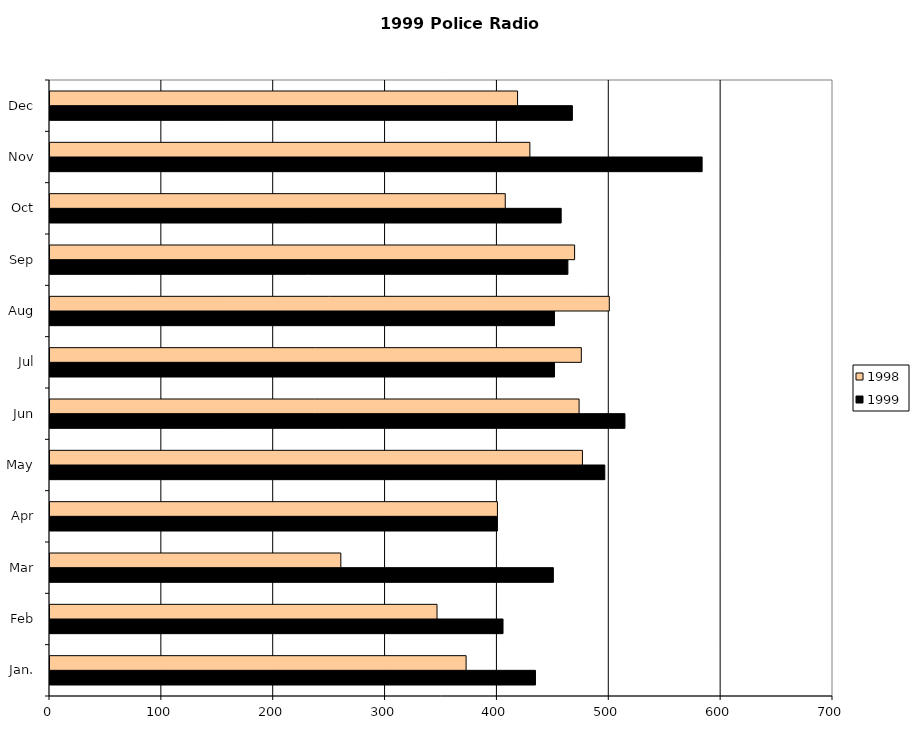
| Category | 1999 | 1998 |
|---|---|---|
| Jan. | 434 | 372 |
| Feb | 405 | 346 |
| Mar | 450 | 260 |
| Apr | 400 | 400 |
| May | 496 | 476 |
| Jun | 514 | 473 |
| Jul | 451 | 475 |
| Aug | 451 | 500 |
| Sep | 463 | 469 |
| Oct | 457 | 407 |
| Nov | 583 | 429 |
| Dec | 467 | 418 |